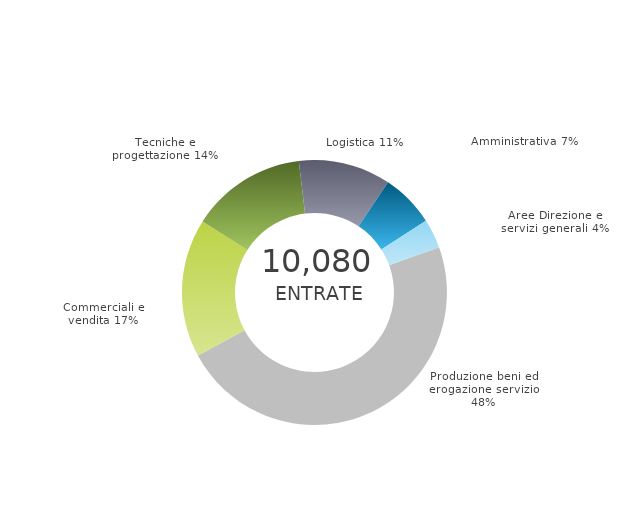
| Category | Series 0 | Series 1 |
|---|---|---|
| Produzione beni ed erogazione servizio | 0 | 0.477 |
| Commerciali e vendita | 0 | 0.169 |
| Tecniche e progettazione | 0 | 0.141 |
| Logistica | 0 | 0.113 |
| Amministrativa | 0 | 0.065 |
| Aree Direzione e servizi generali | 0 | 0.036 |